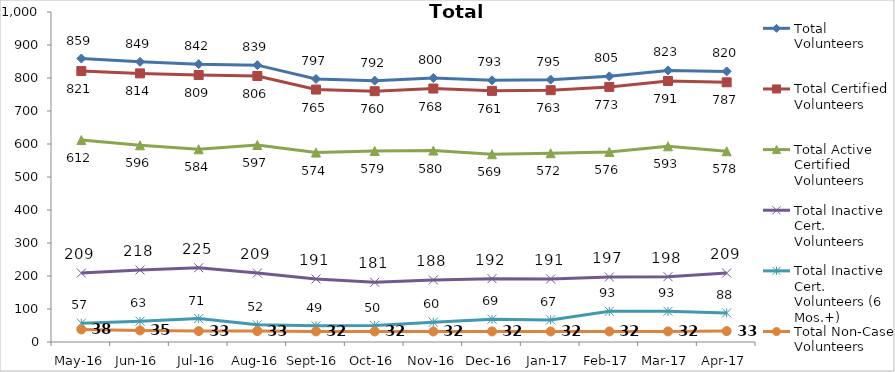
| Category | Total Volunteers | Total Certified Volunteers | Total Active Certified Volunteers | Total Inactive Cert. Volunteers | Total Inactive Cert. Volunteers (6 Mos.+) | Total Non-Case Volunteers |
|---|---|---|---|---|---|---|
| May-16 | 859 | 821 | 612 | 209 | 57 | 38 |
| Jun-16 | 849 | 814 | 596 | 218 | 63 | 35 |
| Jul-16 | 842 | 809 | 584 | 225 | 71 | 33 |
| Aug-16 | 839 | 806 | 597 | 209 | 52 | 33 |
| Sep-16 | 797 | 765 | 574 | 191 | 49 | 32 |
| Oct-16 | 792 | 760 | 579 | 181 | 50 | 32 |
| Nov-16 | 800 | 768 | 580 | 188 | 60 | 32 |
| Dec-16 | 793 | 761 | 569 | 192 | 69 | 32 |
| Jan-17 | 795 | 763 | 572 | 191 | 67 | 32 |
| Feb-17 | 805 | 773 | 576 | 197 | 93 | 32 |
| Mar-17 | 823 | 791 | 593 | 198 | 93 | 32 |
| Apr-17 | 820 | 787 | 578 | 209 | 88 | 33 |